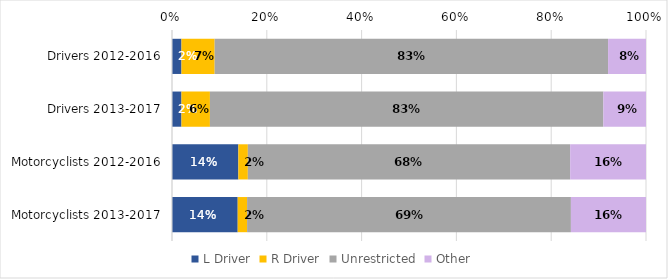
| Category | L Driver | R Driver | Unrestricted | Other |
|---|---|---|---|---|
| Drivers 2012-2016 | 0.02 | 0.07 | 0.83 | 0.08 |
| Drivers 2013-2017 | 0.02 | 0.06 | 0.83 | 0.09 |
| Motorcyclists 2012-2016 | 0.14 | 0.02 | 0.68 | 0.16 |
| Motorcyclists 2013-2017 | 0.14 | 0.02 | 0.69 | 0.16 |